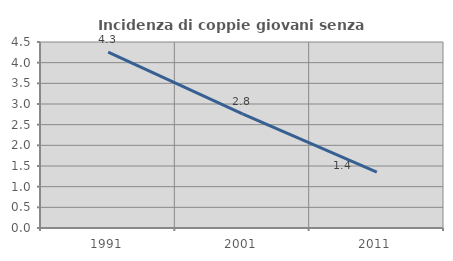
| Category | Incidenza di coppie giovani senza figli |
|---|---|
| 1991.0 | 4.254 |
| 2001.0 | 2.759 |
| 2011.0 | 1.354 |